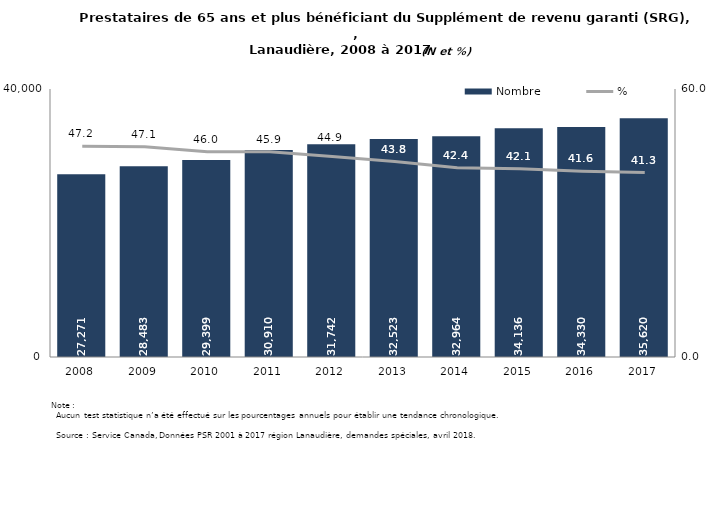
| Category | Nombre |
|---|---|
| 2008.0 | 27271 |
| 2009.0 | 28483 |
| 2010.0 | 29399 |
| 2011.0 | 30910 |
| 2012.0 | 31742 |
| 2013.0 | 32523 |
| 2014.0 | 32964 |
| 2015.0 | 34136 |
| 2016.0 | 34330 |
| 2017.0 | 35620 |